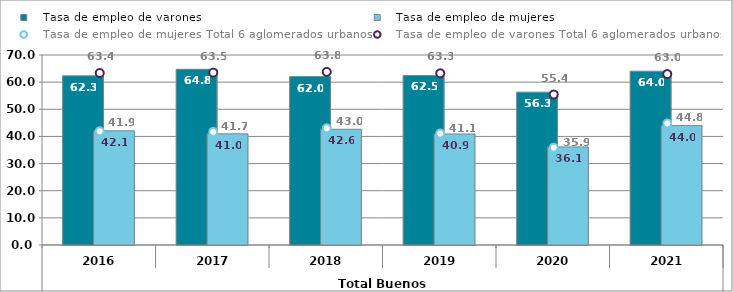
| Category |    Tasa de empleo de varones |    Tasa de empleo de mujeres |
|---|---|---|
| 0 | 62.32 | 42.06 |
| 1 | 64.75 | 40.95 |
| 2 | 62.04 | 42.63 |
| 3 | 62.45 | 40.9 |
| 4 | 56.32 | 36.13 |
| 5 | 64.04 | 43.99 |